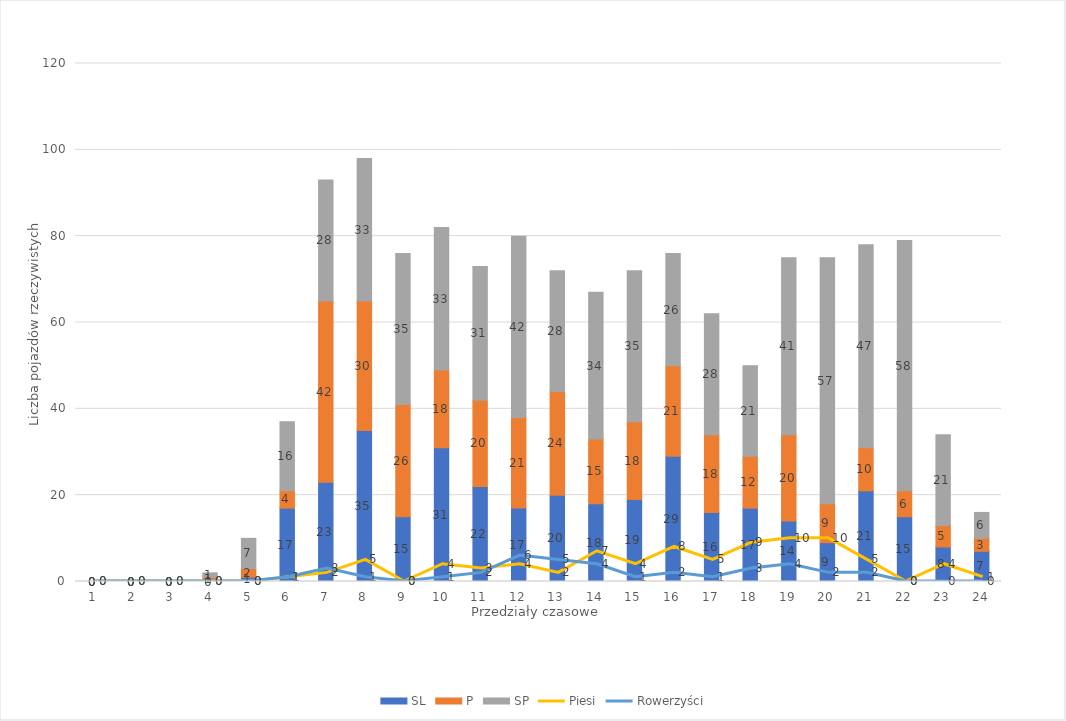
| Category | SL | P | SP |
|---|---|---|---|
| 0 | 0 | 0 | 0 |
| 1 | 0 | 0 | 0 |
| 2 | 0 | 0 | 0 |
| 3 | 0 | 1 | 1 |
| 4 | 1 | 2 | 7 |
| 5 | 17 | 4 | 16 |
| 6 | 23 | 42 | 28 |
| 7 | 35 | 30 | 33 |
| 8 | 15 | 26 | 35 |
| 9 | 31 | 18 | 33 |
| 10 | 22 | 20 | 31 |
| 11 | 17 | 21 | 42 |
| 12 | 20 | 24 | 28 |
| 13 | 18 | 15 | 34 |
| 14 | 19 | 18 | 35 |
| 15 | 29 | 21 | 26 |
| 16 | 16 | 18 | 28 |
| 17 | 17 | 12 | 21 |
| 18 | 14 | 20 | 41 |
| 19 | 9 | 9 | 57 |
| 20 | 21 | 10 | 47 |
| 21 | 15 | 6 | 58 |
| 22 | 8 | 5 | 21 |
| 23 | 7 | 3 | 6 |